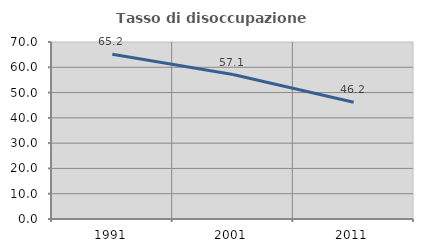
| Category | Tasso di disoccupazione giovanile  |
|---|---|
| 1991.0 | 65.19 |
| 2001.0 | 57.143 |
| 2011.0 | 46.154 |